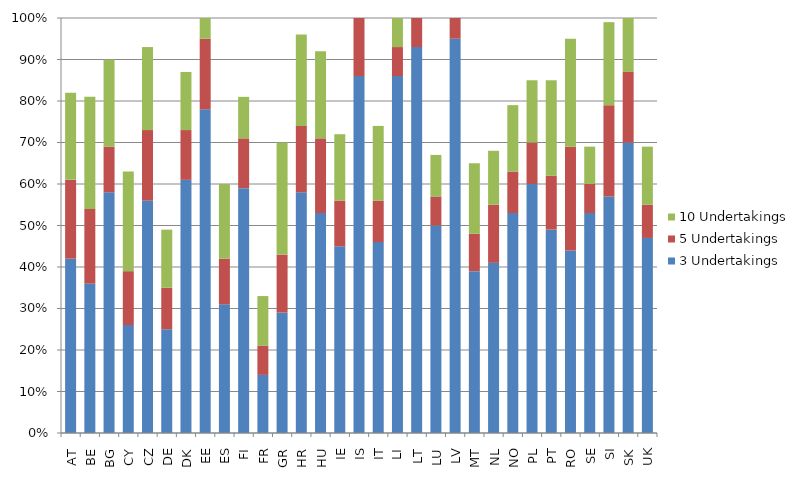
| Category | 3 Undertakings | 5 Undertakings | 10 Undertakings |
|---|---|---|---|
| AT | 0.42 | 0.19 | 0.21 |
| BE | 0.36 | 0.18 | 0.27 |
| BG | 0.58 | 0.11 | 0.21 |
| CY | 0.26 | 0.13 | 0.24 |
| CZ | 0.56 | 0.17 | 0.2 |
| DE | 0.25 | 0.1 | 0.14 |
| DK | 0.61 | 0.12 | 0.14 |
| EE | 0.78 | 0.17 | 0.05 |
| ES | 0.31 | 0.11 | 0.18 |
| FI | 0.59 | 0.12 | 0.1 |
| FR | 0.14 | 0.07 | 0.12 |
| GR | 0.29 | 0.14 | 0.27 |
| HR | 0.58 | 0.16 | 0.22 |
| HU | 0.53 | 0.18 | 0.21 |
| IE | 0.45 | 0.11 | 0.16 |
| IS | 0.86 | 0.14 | 0 |
| IT | 0.46 | 0.1 | 0.18 |
| LI | 0.86 | 0.07 | 0.07 |
| LT | 0.93 | 0.07 | 0 |
| LU | 0.5 | 0.07 | 0.1 |
| LV | 0.95 | 0.05 | 0 |
| MT | 0.39 | 0.09 | 0.17 |
| NL | 0.41 | 0.14 | 0.13 |
| NO | 0.53 | 0.1 | 0.16 |
| PL | 0.6 | 0.1 | 0.15 |
| PT | 0.49 | 0.13 | 0.23 |
| RO | 0.44 | 0.25 | 0.26 |
| SE | 0.53 | 0.07 | 0.09 |
| SI | 0.57 | 0.22 | 0.2 |
| SK | 0.7 | 0.17 | 0.13 |
| UK | 0.47 | 0.08 | 0.14 |